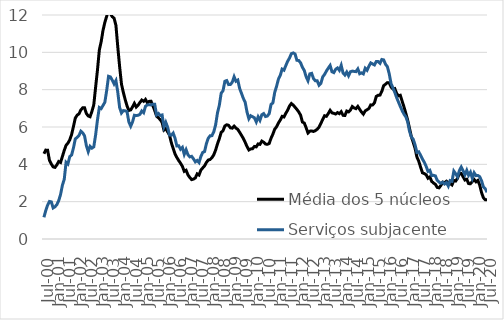
| Category | Média dos 5 núcleos | Serviços subjacente |
|---|---|---|
| 2000-07-01 | 4.567 | 1.163 |
| 2000-08-01 | 4.762 | 1.527 |
| 2000-09-01 | 4.755 | 1.812 |
| 2000-10-01 | 4.213 | 2.011 |
| 2000-11-01 | 4.019 | 1.99 |
| 2000-12-01 | 3.863 | 1.663 |
| 2001-01-01 | 3.835 | 1.727 |
| 2001-02-01 | 3.973 | 1.843 |
| 2001-03-01 | 4.152 | 2.052 |
| 2001-04-01 | 4.099 | 2.38 |
| 2001-05-01 | 4.419 | 2.88 |
| 2001-06-01 | 4.743 | 3.193 |
| 2001-07-01 | 5.02 | 4.113 |
| 2001-08-01 | 5.136 | 4.021 |
| 2001-09-01 | 5.314 | 4.417 |
| 2001-10-01 | 5.599 | 4.499 |
| 2001-11-01 | 6.03 | 4.884 |
| 2001-12-01 | 6.478 | 5.364 |
| 2002-01-01 | 6.634 | 5.442 |
| 2002-02-01 | 6.708 | 5.544 |
| 2002-03-01 | 6.912 | 5.776 |
| 2002-04-01 | 7.027 | 5.687 |
| 2002-05-01 | 7.026 | 5.527 |
| 2002-06-01 | 6.723 | 4.999 |
| 2002-07-01 | 6.59 | 4.678 |
| 2002-08-01 | 6.551 | 4.967 |
| 2002-09-01 | 6.843 | 4.868 |
| 2002-10-01 | 7.187 | 4.935 |
| 2002-11-01 | 8.138 | 5.58 |
| 2002-12-01 | 9.055 | 6.386 |
| 2003-01-01 | 10.121 | 7.045 |
| 2003-02-01 | 10.569 | 6.985 |
| 2003-03-01 | 11.175 | 7.155 |
| 2003-04-01 | 11.607 | 7.327 |
| 2003-05-01 | 11.937 | 7.963 |
| 2003-06-01 | 12.245 | 8.717 |
| 2003-07-01 | 12.081 | 8.684 |
| 2003-08-01 | 11.91 | 8.509 |
| 2003-09-01 | 11.827 | 8.308 |
| 2003-10-01 | 11.444 | 8.487 |
| 2003-11-01 | 10.29 | 7.865 |
| 2003-12-01 | 9.235 | 7.041 |
| 2004-01-01 | 8.297 | 6.751 |
| 2004-02-01 | 7.859 | 6.877 |
| 2004-03-01 | 7.47 | 6.866 |
| 2004-04-01 | 7.134 | 6.832 |
| 2004-05-01 | 6.889 | 6.273 |
| 2004-06-01 | 6.914 | 6.045 |
| 2004-07-01 | 7.079 | 6.275 |
| 2004-08-01 | 7.267 | 6.63 |
| 2004-09-01 | 7.069 | 6.611 |
| 2004-10-01 | 7.169 | 6.631 |
| 2004-11-01 | 7.316 | 6.677 |
| 2004-12-01 | 7.444 | 6.861 |
| 2005-01-01 | 7.376 | 6.767 |
| 2005-02-01 | 7.478 | 7.107 |
| 2005-03-01 | 7.296 | 7.185 |
| 2005-04-01 | 7.372 | 7.192 |
| 2005-05-01 | 7.382 | 7.183 |
| 2005-06-01 | 7.137 | 7.219 |
| 2005-07-01 | 6.89 | 7.223 |
| 2005-08-01 | 6.586 | 6.647 |
| 2005-09-01 | 6.494 | 6.724 |
| 2005-10-01 | 6.395 | 6.617 |
| 2005-11-01 | 6.243 | 6.645 |
| 2005-12-01 | 5.836 | 6.01 |
| 2006-01-01 | 5.917 | 6.25 |
| 2006-02-01 | 5.742 | 5.989 |
| 2006-03-01 | 5.569 | 5.573 |
| 2006-04-01 | 5.159 | 5.558 |
| 2006-05-01 | 4.85 | 5.674 |
| 2006-06-01 | 4.561 | 5.401 |
| 2006-07-01 | 4.365 | 4.987 |
| 2006-08-01 | 4.202 | 4.993 |
| 2006-09-01 | 4.058 | 4.807 |
| 2006-10-01 | 3.888 | 4.907 |
| 2006-11-01 | 3.624 | 4.534 |
| 2006-12-01 | 3.682 | 4.782 |
| 2007-01-01 | 3.436 | 4.515 |
| 2007-02-01 | 3.294 | 4.4 |
| 2007-03-01 | 3.182 | 4.429 |
| 2007-04-01 | 3.21 | 4.296 |
| 2007-05-01 | 3.272 | 4.133 |
| 2007-06-01 | 3.487 | 4.209 |
| 2007-07-01 | 3.427 | 4.097 |
| 2007-08-01 | 3.691 | 4.421 |
| 2007-09-01 | 3.807 | 4.638 |
| 2007-10-01 | 3.92 | 4.684 |
| 2007-11-01 | 4.1 | 5.113 |
| 2007-12-01 | 4.231 | 5.398 |
| 2008-01-01 | 4.258 | 5.529 |
| 2008-02-01 | 4.357 | 5.537 |
| 2008-03-01 | 4.514 | 5.745 |
| 2008-04-01 | 4.768 | 6.121 |
| 2008-05-01 | 5.098 | 6.758 |
| 2008-06-01 | 5.378 | 7.167 |
| 2008-07-01 | 5.711 | 7.809 |
| 2008-08-01 | 5.802 | 7.947 |
| 2008-09-01 | 6.057 | 8.45 |
| 2008-10-01 | 6.119 | 8.488 |
| 2008-11-01 | 6.092 | 8.272 |
| 2008-12-01 | 5.955 | 8.278 |
| 2009-01-01 | 5.938 | 8.399 |
| 2009-02-01 | 6.047 | 8.692 |
| 2009-03-01 | 5.94 | 8.452 |
| 2009-04-01 | 5.871 | 8.513 |
| 2009-05-01 | 5.716 | 8.063 |
| 2009-06-01 | 5.553 | 7.803 |
| 2009-07-01 | 5.387 | 7.531 |
| 2009-08-01 | 5.179 | 7.323 |
| 2009-09-01 | 4.951 | 6.798 |
| 2009-10-01 | 4.77 | 6.443 |
| 2009-11-01 | 4.826 | 6.603 |
| 2009-12-01 | 4.838 | 6.549 |
| 2010-01-01 | 4.958 | 6.493 |
| 2010-02-01 | 4.937 | 6.272 |
| 2010-03-01 | 5.093 | 6.545 |
| 2010-04-01 | 5.07 | 6.358 |
| 2010-05-01 | 5.244 | 6.657 |
| 2010-06-01 | 5.184 | 6.719 |
| 2010-07-01 | 5.087 | 6.561 |
| 2010-08-01 | 5.072 | 6.589 |
| 2010-09-01 | 5.116 | 6.714 |
| 2010-10-01 | 5.4 | 7.209 |
| 2010-11-01 | 5.617 | 7.291 |
| 2010-12-01 | 5.886 | 7.855 |
| 2011-01-01 | 6.014 | 8.182 |
| 2011-02-01 | 6.216 | 8.564 |
| 2011-03-01 | 6.374 | 8.765 |
| 2011-04-01 | 6.57 | 9.101 |
| 2011-05-01 | 6.538 | 9.044 |
| 2011-06-01 | 6.735 | 9.29 |
| 2011-07-01 | 6.902 | 9.523 |
| 2011-08-01 | 7.123 | 9.694 |
| 2011-09-01 | 7.257 | 9.928 |
| 2011-10-01 | 7.177 | 9.968 |
| 2011-11-01 | 7.058 | 9.914 |
| 2011-12-01 | 6.943 | 9.573 |
| 2012-01-01 | 6.807 | 9.563 |
| 2012-02-01 | 6.636 | 9.439 |
| 2012-03-01 | 6.264 | 9.196 |
| 2012-04-01 | 6.213 | 9.028 |
| 2012-05-01 | 5.963 | 8.694 |
| 2012-06-01 | 5.681 | 8.479 |
| 2012-07-01 | 5.777 | 8.846 |
| 2012-08-01 | 5.787 | 8.874 |
| 2012-09-01 | 5.761 | 8.592 |
| 2012-10-01 | 5.805 | 8.473 |
| 2012-11-01 | 5.881 | 8.477 |
| 2012-12-01 | 5.991 | 8.239 |
| 2013-01-01 | 6.196 | 8.341 |
| 2013-02-01 | 6.407 | 8.688 |
| 2013-03-01 | 6.604 | 8.819 |
| 2013-04-01 | 6.573 | 9 |
| 2013-05-01 | 6.721 | 9.155 |
| 2013-06-01 | 6.893 | 9.296 |
| 2013-07-01 | 6.759 | 8.959 |
| 2013-08-01 | 6.732 | 8.914 |
| 2013-09-01 | 6.695 | 9.094 |
| 2013-10-01 | 6.772 | 9.165 |
| 2013-11-01 | 6.715 | 9.035 |
| 2013-12-01 | 6.82 | 9.303 |
| 2014-01-01 | 6.626 | 8.897 |
| 2014-02-01 | 6.617 | 8.786 |
| 2014-03-01 | 6.855 | 8.944 |
| 2014-04-01 | 6.812 | 8.745 |
| 2014-05-01 | 6.91 | 8.96 |
| 2014-06-01 | 7.098 | 8.994 |
| 2014-07-01 | 7.02 | 8.977 |
| 2014-08-01 | 6.982 | 8.965 |
| 2014-09-01 | 7.103 | 9.111 |
| 2014-10-01 | 6.949 | 8.853 |
| 2014-11-01 | 6.802 | 8.9 |
| 2014-12-01 | 6.69 | 8.846 |
| 2015-01-01 | 6.863 | 9.145 |
| 2015-02-01 | 6.923 | 9.038 |
| 2015-03-01 | 6.992 | 9.258 |
| 2015-04-01 | 7.185 | 9.434 |
| 2015-05-01 | 7.18 | 9.379 |
| 2015-06-01 | 7.294 | 9.325 |
| 2015-07-01 | 7.639 | 9.512 |
| 2015-08-01 | 7.698 | 9.506 |
| 2015-09-01 | 7.709 | 9.411 |
| 2015-10-01 | 7.913 | 9.617 |
| 2015-11-01 | 8.213 | 9.594 |
| 2015-12-01 | 8.294 | 9.36 |
| 2016-01-01 | 8.377 | 9.236 |
| 2016-02-01 | 8.369 | 8.854 |
| 2016-03-01 | 8.147 | 8.328 |
| 2016-04-01 | 8.038 | 8.102 |
| 2016-05-01 | 8.061 | 7.86 |
| 2016-06-01 | 7.803 | 7.581 |
| 2016-07-01 | 7.669 | 7.342 |
| 2016-08-01 | 7.701 | 7.101 |
| 2016-09-01 | 7.383 | 6.881 |
| 2016-10-01 | 7.074 | 6.684 |
| 2016-11-01 | 6.73 | 6.545 |
| 2016-12-01 | 6.366 | 6.271 |
| 2017-01-01 | 5.927 | 5.771 |
| 2017-02-01 | 5.474 | 5.466 |
| 2017-03-01 | 5.179 | 5.34 |
| 2017-04-01 | 4.859 | 5.046 |
| 2017-05-01 | 4.393 | 4.638 |
| 2017-06-01 | 4.166 | 4.671 |
| 2017-07-01 | 3.85 | 4.481 |
| 2017-08-01 | 3.545 | 4.283 |
| 2017-09-01 | 3.505 | 4.11 |
| 2017-10-01 | 3.44 | 3.895 |
| 2017-11-01 | 3.256 | 3.621 |
| 2017-12-01 | 3.324 | 3.68 |
| 2018-01-01 | 3.086 | 3.403 |
| 2018-02-01 | 2.998 | 3.41 |
| 2018-03-01 | 2.932 | 3.381 |
| 2018-04-01 | 2.763 | 3.144 |
| 2018-05-01 | 2.742 | 3.047 |
| 2018-06-01 | 2.871 | 2.984 |
| 2018-07-01 | 3.045 | 3.04 |
| 2018-08-01 | 3.013 | 2.946 |
| 2018-09-01 | 3.096 | 3.026 |
| 2018-10-01 | 3.019 | 2.834 |
| 2018-11-01 | 2.968 | 3.131 |
| 2018-12-01 | 2.897 | 3.095 |
| 2019-01-01 | 3.137 | 3.636 |
| 2019-02-01 | 3.106 | 3.494 |
| 2019-03-01 | 3.256 | 3.327 |
| 2019-04-01 | 3.509 | 3.662 |
| 2019-05-01 | 3.508 | 3.855 |
| 2019-06-01 | 3.338 | 3.655 |
| 2019-07-01 | 3.159 | 3.442 |
| 2019-08-01 | 3.199 | 3.677 |
| 2019-09-01 | 2.967 | 3.412 |
| 2019-10-01 | 2.964 | 3.578 |
| 2019-11-01 | 3.078 | 3.251 |
| 2019-12-01 | 3.186 | 3.547 |
| 2020-01-01 | 3.064 | 3.394 |
| 2020-02-01 | 3.137 | 3.403 |
| 2020-03-01 | 2.895 | 3.34 |
| 2020-04-01 | 2.488 | 3.124 |
| 2020-05-01 | 2.211 | 2.795 |
| 2020-06-01 | 2.106 | 2.692 |
| 2020-07-01 | 2.096 | 2.504 |